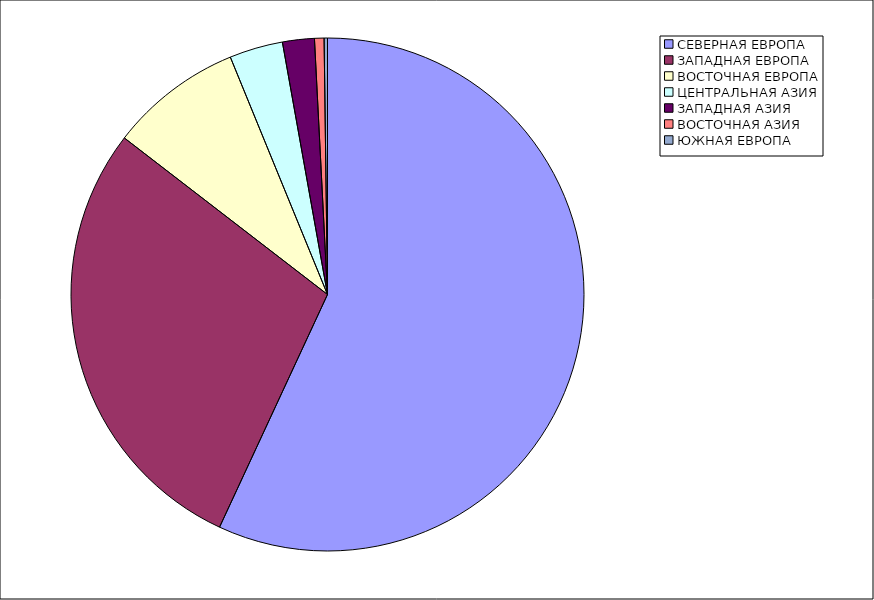
| Category | Оборот |
|---|---|
| СЕВЕРНАЯ ЕВРОПА | 56.915 |
| ЗАПАДНАЯ ЕВРОПА | 28.534 |
| ВОСТОЧНАЯ ЕВРОПА | 8.367 |
| ЦЕНТРАЛЬНАЯ АЗИЯ | 3.369 |
| ЗАПАДНАЯ АЗИЯ | 2.005 |
| ВОСТОЧНАЯ АЗИЯ | 0.6 |
| ЮЖНАЯ ЕВРОПА | 0.211 |